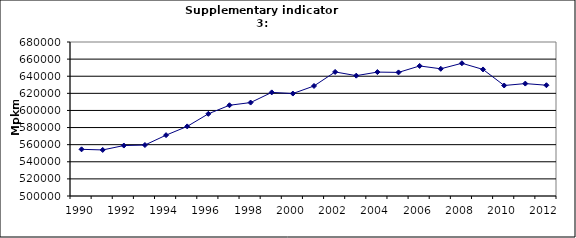
| Category | Passenger transport by cars, Mpkm |
|---|---|
| 1990 | 554558.563 |
| 1991 | 553827.624 |
| 1992 | 558956.885 |
| 1993 | 559590.121 |
| 1994 | 571131.959 |
| 1995 | 581345.784 |
| 1996 | 596040.657 |
| 1997 | 606059.18 |
| 1998 | 609205.437 |
| 1999 | 621108.391 |
| 2000 | 619748.526 |
| 2001 | 628601.72 |
| 2002 | 645015.2 |
| 2003 | 640647.348 |
| 2004 | 644836.69 |
| 2005 | 644464.173 |
| 2006 | 652019.291 |
| 2007 | 648686.441 |
| 2008 | 655145.324 |
| 2009 | 647920.781 |
| 2010 | 629170.275 |
| 2011 | 631394.799 |
| 2012 | 629482.865 |